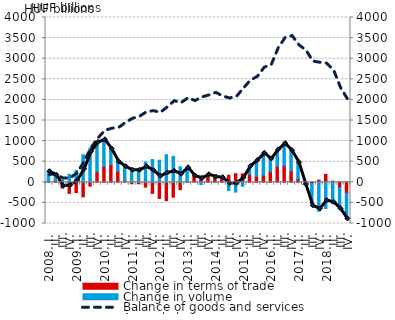
| Category | Change in terms of trade | Change in volume |
|---|---|---|
| 2008. I. | -1.044 | 259.64 |
|          II. | 41.359 | 132.065 |
|          III. | -139.621 | 47.132 |
|          IV. | -268.994 | 193.23 |
| 2009. I. | -248.307 | 288.029 |
|          II. | -354.843 | 669.239 |
|          III. | -92.143 | 832.273 |
|          IV. | 258.888 | 707.629 |
| 2010. I. | 384.28 | 647.365 |
|          II. | 422.697 | 381.365 |
|          III. | 265.539 | 228.685 |
|          IV. | 38.59 | 338.6 |
| 2011. I. | -36.828 | 328.117 |
|          II. | -36.355 | 329.11 |
|          III. | -116.756 | 494.304 |
|          IV. | -269.961 | 552.55 |
| 2012. I. | -391.59 | 536.595 |
|          II. | -444.132 | 669.038 |
|          III. | -361.172 | 629.417 |
|          IV. | -179.441 | 376.274 |
| 2013. I. | -4.515 | 358.186 |
|          II. | 139.151 | 14.248 |
|          III. | 149.526 | -55.397 |
|          IV. | 173.27 | 10.534 |
| 2014. I. | 137.22 | -7.699 |
|          II. | 88.476 | 22.431 |
|          III. | 170.33 | -198.095 |
|          IV. | 209.329 | -237.909 |
| 2015. I. | 204.963 | -95.757 |
|          II. | 194.115 | 193.073 |
|          III. | 147.463 | 380.049 |
|          IV. | 169.977 | 535.273 |
| 2016. I. | 260.311 | 305.439 |
|          II. | 380.884 | 404.034 |
|          III. | 402.048 | 538.793 |
|          IV. | 276.22 | 489.407 |
| 2017. I. | 78.341 | 399.031 |
|          II. | -3.749 | -52.319 |
|          III. | -31.372 | -540.022 |
|          IV. | 52.727 | -701.552 |
| 2018. I. | 192.605 | -635.947 |
|          II. | 28.428 | -515.011 |
|          III. | -126.93 | -517.036 |
|          IV. | -265.58 | -624.541 |